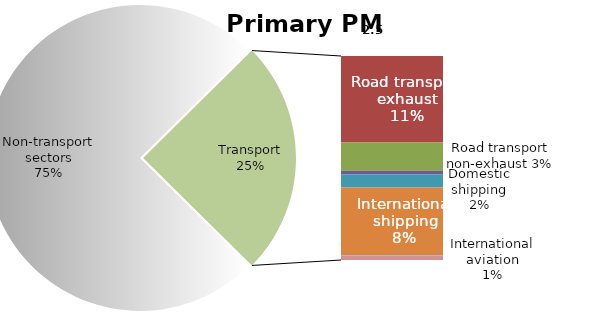
| Category | Series 0 |
|---|---|
| Non-transport sectors | 1107.471 |
| Road transport exhaust | 154.669 |
| Road transport non-exhaust | 50.704 |
| Railways | 6.445 |
| Domestic shipping | 23.51 |
| International shipping | 120.938 |
| Domestic aviation | 1.103 |
| International aviation | 7.797 |